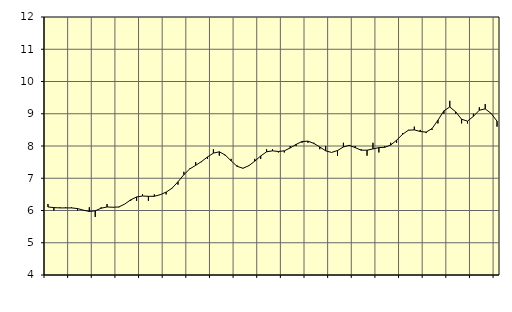
| Category | Piggar | Byggverksamhet, SNI 41-43 |
|---|---|---|
| nan | 6.2 | 6.11 |
| 1.0 | 6 | 6.09 |
| 1.0 | 6.1 | 6.08 |
| 1.0 | 6.1 | 6.08 |
| nan | 6.1 | 6.08 |
| 2.0 | 6 | 6.06 |
| 2.0 | 6 | 6.01 |
| 2.0 | 6.1 | 5.97 |
| nan | 5.8 | 5.99 |
| 3.0 | 6.1 | 6.07 |
| 3.0 | 6.2 | 6.11 |
| 3.0 | 6.1 | 6.1 |
| nan | 6.1 | 6.11 |
| 4.0 | 6.2 | 6.2 |
| 4.0 | 6.3 | 6.33 |
| 4.0 | 6.3 | 6.42 |
| nan | 6.5 | 6.45 |
| 5.0 | 6.3 | 6.44 |
| 5.0 | 6.5 | 6.44 |
| 5.0 | 6.5 | 6.49 |
| nan | 6.5 | 6.57 |
| 6.0 | 6.7 | 6.69 |
| 6.0 | 6.8 | 6.89 |
| 6.0 | 7.2 | 7.11 |
| nan | 7.3 | 7.29 |
| 7.0 | 7.5 | 7.4 |
| 7.0 | 7.5 | 7.52 |
| 7.0 | 7.6 | 7.66 |
| nan | 7.9 | 7.78 |
| 8.0 | 7.7 | 7.82 |
| 8.0 | 7.7 | 7.72 |
| 8.0 | 7.6 | 7.54 |
| nan | 7.4 | 7.37 |
| 9.0 | 7.3 | 7.31 |
| 9.0 | 7.4 | 7.39 |
| 9.0 | 7.6 | 7.53 |
| nan | 7.6 | 7.69 |
| 10.0 | 7.9 | 7.82 |
| 10.0 | 7.9 | 7.85 |
| 10.0 | 7.8 | 7.83 |
| nan | 7.8 | 7.85 |
| 11.0 | 8 | 7.94 |
| 11.0 | 8 | 8.05 |
| 11.0 | 8.1 | 8.14 |
| nan | 8.1 | 8.15 |
| 12.0 | 8.1 | 8.08 |
| 12.0 | 7.9 | 7.97 |
| 12.0 | 8 | 7.85 |
| nan | 7.8 | 7.8 |
| 13.0 | 7.7 | 7.86 |
| 13.0 | 8.1 | 7.97 |
| 13.0 | 8 | 8.02 |
| nan | 8 | 7.95 |
| 14.0 | 7.9 | 7.87 |
| 14.0 | 7.7 | 7.87 |
| 14.0 | 8.1 | 7.91 |
| nan | 7.8 | 7.95 |
| 15.0 | 8 | 7.96 |
| 15.0 | 8.1 | 8.03 |
| 15.0 | 8.1 | 8.18 |
| nan | 8.4 | 8.36 |
| 16.0 | 8.5 | 8.49 |
| 16.0 | 8.6 | 8.5 |
| 16.0 | 8.5 | 8.45 |
| nan | 8.4 | 8.43 |
| 17.0 | 8.5 | 8.54 |
| 17.0 | 8.7 | 8.8 |
| 17.0 | 9 | 9.09 |
| nan | 9.4 | 9.21 |
| 18.0 | 9 | 9.06 |
| 18.0 | 8.7 | 8.83 |
| 18.0 | 8.7 | 8.77 |
| nan | 9 | 8.92 |
| 19.0 | 9.2 | 9.11 |
| 19.0 | 9.3 | 9.15 |
| 19.0 | 9 | 9.01 |
| nan | 8.6 | 8.77 |